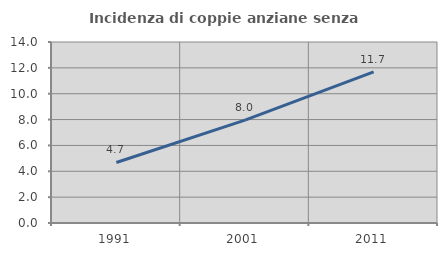
| Category | Incidenza di coppie anziane senza figli  |
|---|---|
| 1991.0 | 4.681 |
| 2001.0 | 7.963 |
| 2011.0 | 11.694 |